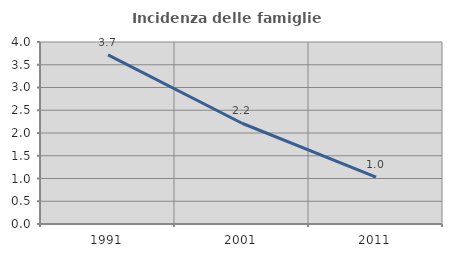
| Category | Incidenza delle famiglie numerose |
|---|---|
| 1991.0 | 3.717 |
| 2001.0 | 2.214 |
| 2011.0 | 1.031 |